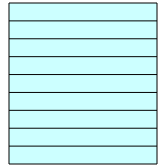
| Category | Series 0 |
|---|---|
| 0 | 0 |
| 1 | 0 |
| 2 | 0 |
| 3 | 0 |
| 4 | 0 |
| 5 | 0 |
| 6 | 0 |
| 7 | 0 |
| 8 | 0 |